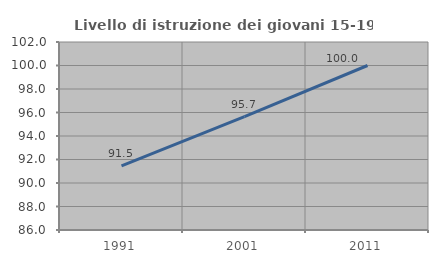
| Category | Livello di istruzione dei giovani 15-19 anni |
|---|---|
| 1991.0 | 91.463 |
| 2001.0 | 95.652 |
| 2011.0 | 100 |